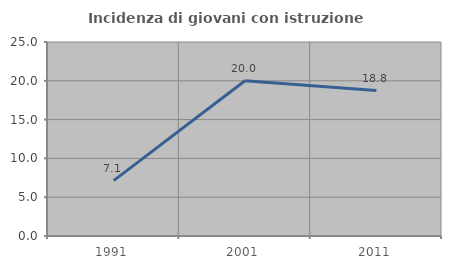
| Category | Incidenza di giovani con istruzione universitaria |
|---|---|
| 1991.0 | 7.143 |
| 2001.0 | 20 |
| 2011.0 | 18.75 |